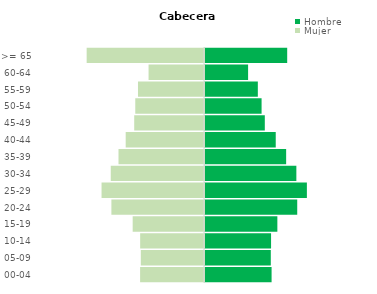
| Category | Hombre | Mujer |
|---|---|---|
| 00-04 | 248150 | -238100 |
| 05-09 | 245201 | -235485 |
| 10-14 | 246191 | -237907 |
| 15-19 | 269655 | -265766 |
| 20-24 | 343711 | -345110 |
| 25-29 | 379682 | -381792 |
| 30-34 | 340457 | -347482 |
| 35-39 | 302407 | -318623 |
| 40-44 | 263620 | -291844 |
| 45-49 | 222897 | -260052 |
| 50-54 | 210858 | -256113 |
| 55-59 | 196878 | -245984 |
| 60-64 | 160600 | -206527 |
| >= 65 | 306305 | -437263 |